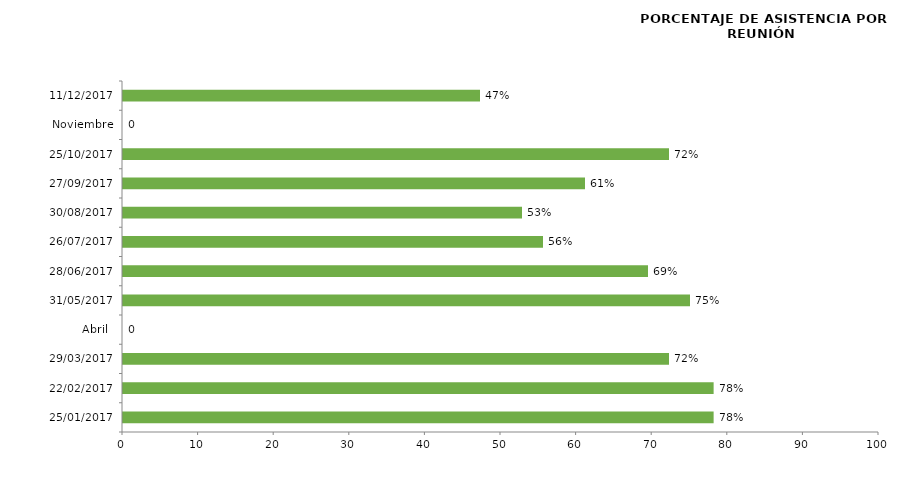
| Category | Series 0 |
|---|---|
| 25/01/2017 | 78.125 |
| 22/02/2017 | 78.125 |
| 29/03/2017 | 72.222 |
| Abril  | 0 |
| 31/05/2017 | 75 |
| 28/06/2017 | 69.444 |
| 26/07/2017 | 55.556 |
| 30/08/2017 | 52.778 |
| 27/09/2017 | 61.111 |
| 25/10/2017 | 72.222 |
| Noviembre | 0 |
| 11/12/2017 | 47.222 |